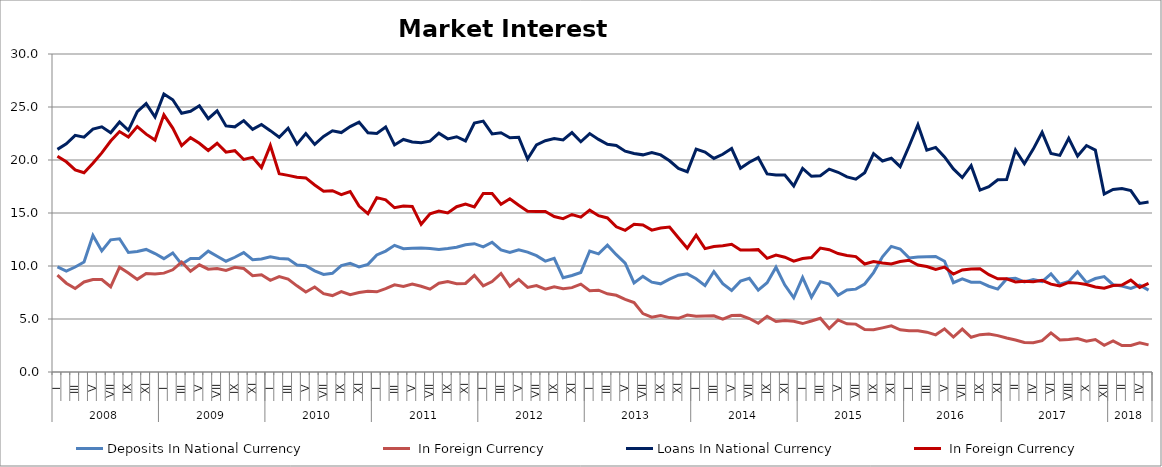
| Category | Deposits | Loans |
|---|---|---|
| 0 | 9.137 | 20.354 |
| 1 | 8.38 | 19.831 |
| 2 | 7.883 | 19.065 |
| 3 | 8.496 | 18.793 |
| 4 | 8.724 | 19.686 |
| 5 | 8.718 | 20.674 |
| 6 | 8.041 | 21.792 |
| 7 | 9.883 | 22.683 |
| 8 | 9.345 | 22.171 |
| 9 | 8.74 | 23.151 |
| 10 | 9.296 | 22.44 |
| 11 | 9.249 | 21.881 |
| 12 | 9.327 | 24.264 |
| 13 | 9.643 | 23.008 |
| 14 | 10.375 | 21.357 |
| 15 | 9.5 | 22.1 |
| 16 | 10.112 | 21.579 |
| 17 | 9.7 | 20.9 |
| 18 | 9.755 | 21.577 |
| 19 | 9.586 | 20.738 |
| 20 | 9.871 | 20.882 |
| 21 | 9.763 | 20.05 |
| 22 | 9.091 | 20.248 |
| 23 | 9.175 | 19.284 |
| 24 | 8.643 | 21.363 |
| 25 | 8.997 | 18.71 |
| 26 | 8.763 | 18.548 |
| 27 | 8.129 | 18.381 |
| 28 | 7.542 | 18.308 |
| 29 | 8.016 | 17.639 |
| 30 | 7.391 | 17.062 |
| 31 | 7.21 | 17.1 |
| 32 | 7.587 | 16.729 |
| 33 | 7.286 | 17.025 |
| 34 | 7.492 | 15.659 |
| 35 | 7.61 | 14.933 |
| 36 | 7.567 | 16.448 |
| 37 | 7.87 | 16.245 |
| 38 | 8.222 | 15.495 |
| 39 | 8.08 | 15.667 |
| 40 | 8.291 | 15.619 |
| 41 | 8.087 | 13.934 |
| 42 | 7.811 | 14.92 |
| 43 | 8.37 | 15.184 |
| 44 | 8.526 | 15.009 |
| 45 | 8.33 | 15.595 |
| 46 | 8.356 | 15.834 |
| 47 | 9.122 | 15.574 |
| 48 | 8.134 | 16.848 |
| 49 | 8.538 | 16.83 |
| 50 | 9.292 | 15.829 |
| 51 | 8.074 | 16.345 |
| 52 | 8.733 | 15.733 |
| 53 | 7.982 | 15.168 |
| 54 | 8.15 | 15.137 |
| 55 | 7.811 | 15.15 |
| 56 | 8.033 | 14.665 |
| 57 | 7.859 | 14.472 |
| 58 | 7.958 | 14.858 |
| 59 | 8.289 | 14.612 |
| 60 | 7.668 | 15.267 |
| 61 | 7.721 | 14.749 |
| 62 | 7.38 | 14.533 |
| 63 | 7.234 | 13.698 |
| 64 | 6.856 | 13.365 |
| 65 | 6.545 | 13.936 |
| 66 | 5.508 | 13.862 |
| 67 | 5.179 | 13.383 |
| 68 | 5.319 | 13.588 |
| 69 | 5.132 | 13.67 |
| 70 | 5.067 | 12.658 |
| 71 | 5.368 | 11.674 |
| 72 | 5.25 | 12.906 |
| 73 | 5.279 | 11.641 |
| 74 | 5.297 | 11.841 |
| 75 | 4.985 | 11.909 |
| 76 | 5.325 | 12.051 |
| 77 | 5.352 | 11.504 |
| 78 | 5.047 | 11.499 |
| 79 | 4.596 | 11.543 |
| 80 | 5.244 | 10.726 |
| 81 | 4.762 | 11.036 |
| 82 | 4.869 | 10.828 |
| 83 | 4.779 | 10.462 |
| 84 | 4.569 | 10.7 |
| 85 | 4.811 | 10.805 |
| 86 | 5.066 | 11.691 |
| 87 | 4.1 | 11.535 |
| 88 | 4.907 | 11.178 |
| 89 | 4.545 | 11 |
| 90 | 4.517 | 10.889 |
| 91 | 4 | 10.188 |
| 92 | 3.981 | 10.416 |
| 93 | 4.164 | 10.276 |
| 94 | 4.358 | 10.188 |
| 95 | 3.977 | 10.418 |
| 96 | 3.892 | 10.543 |
| 97 | 3.89 | 10.092 |
| 98 | 3.757 | 9.946 |
| 99 | 3.505 | 9.677 |
| 100 | 4.071 | 9.899 |
| 101 | 3.296 | 9.237 |
| 102 | 4.052 | 9.631 |
| 103 | 3.28 | 9.709 |
| 104 | 3.523 | 9.747 |
| 105 | 3.578 | 9.18 |
| 106 | 3.431 | 8.793 |
| 107 | 3.202 | 8.797 |
| 108 | 3.022 | 8.494 |
| 109 | 2.785 | 8.558 |
| 110 | 2.769 | 8.517 |
| 111 | 2.953 | 8.646 |
| 112 | 3.69 | 8.286 |
| 113 | 3.022 | 8.114 |
| 114 | 3.063 | 8.452 |
| 115 | 3.156 | 8.385 |
| 116 | 2.9 | 8.257 |
| 117 | 3.057 | 8.025 |
| 118 | 2.522 | 7.91 |
| 119 | 2.938 | 8.164 |
| 120 | 2.492 | 8.208 |
| 121 | 2.51 | 8.664 |
| 122 | 2.75 | 7.978 |
| 123 | 2.556 | 8.364 |